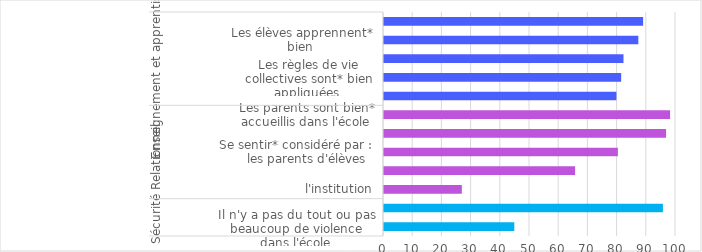
| Category | Series 0 |
|---|---|
| 0 | 44.618 |
| 1 | 95.513 |
| 2 | 26.657 |
| 3 | 65.438 |
| 4 | 80.101 |
| 5 | 96.6 |
| 6 | 97.973 |
| 7 | 79.594 |
| 8 | 81.221 |
| 9 | 82.016 |
| 10 | 87.105 |
| 11 | 88.743 |